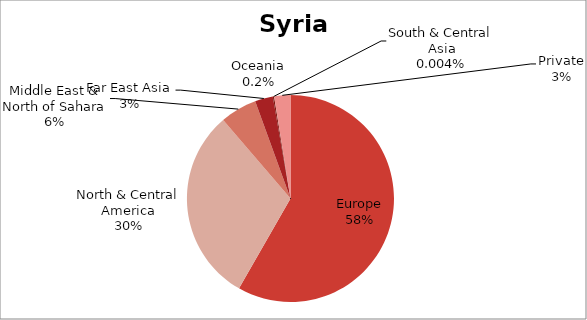
| Category | US$ millions |
|---|---|
| Europe | 1459.434 |
| North & Central America | 762.287 |
| Middle East & North of Sahara | 143.729 |
| Far East Asia | 70.08 |
| Oceania | 5.03 |
| South & Central Asia | 0.1 |
| Private | 63.554 |